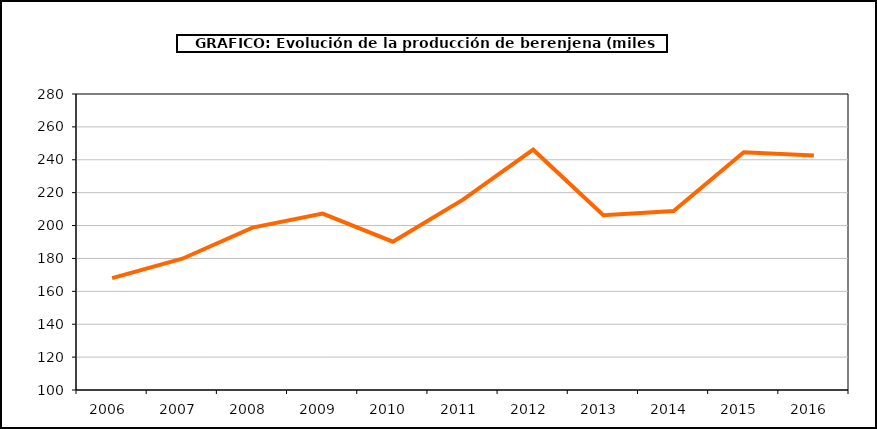
| Category | producción |
|---|---|
| 2006.0 | 167.991 |
| 2007.0 | 179.826 |
| 2008.0 | 198.768 |
| 2009.0 | 207.269 |
| 2010.0 | 190.195 |
| 2011.0 | 215.769 |
| 2012.0 | 246.142 |
| 2013.0 | 206.333 |
| 2014.0 | 208.821 |
| 2015.0 | 244.54 |
| 2016.0 | 242.643 |